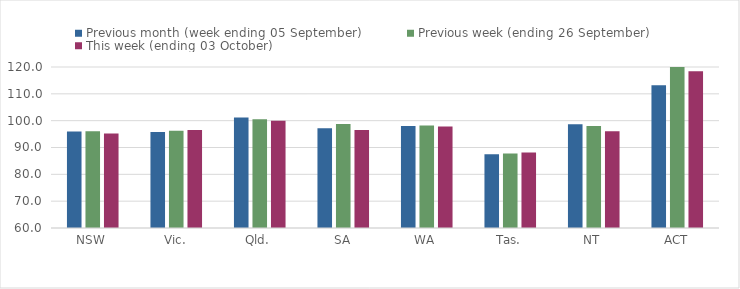
| Category | Previous month (week ending 05 September) | Previous week (ending 26 September) | This week (ending 03 October) |
|---|---|---|---|
| NSW | 95.94 | 96.07 | 95.24 |
| Vic. | 95.79 | 96.25 | 96.53 |
| Qld. | 101.22 | 100.5 | 99.99 |
| SA | 97.15 | 98.72 | 96.54 |
| WA | 97.99 | 98.18 | 97.79 |
| Tas. | 87.52 | 87.81 | 88.12 |
| NT | 98.7 | 98.05 | 96.04 |
| ACT | 113.16 | 126.32 | 118.42 |